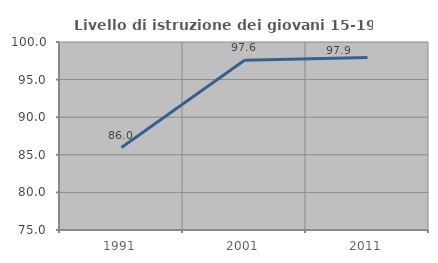
| Category | Livello di istruzione dei giovani 15-19 anni |
|---|---|
| 1991.0 | 85.965 |
| 2001.0 | 97.581 |
| 2011.0 | 97.931 |